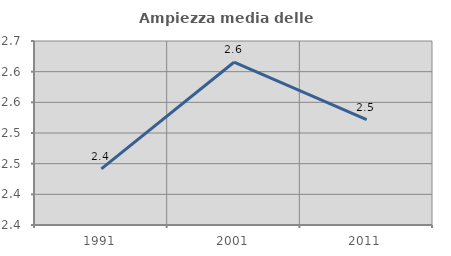
| Category | Ampiezza media delle famiglie |
|---|---|
| 1991.0 | 2.442 |
| 2001.0 | 2.615 |
| 2011.0 | 2.522 |